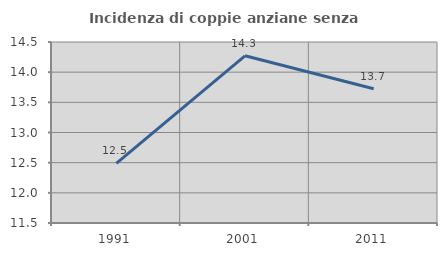
| Category | Incidenza di coppie anziane senza figli  |
|---|---|
| 1991.0 | 12.488 |
| 2001.0 | 14.271 |
| 2011.0 | 13.725 |